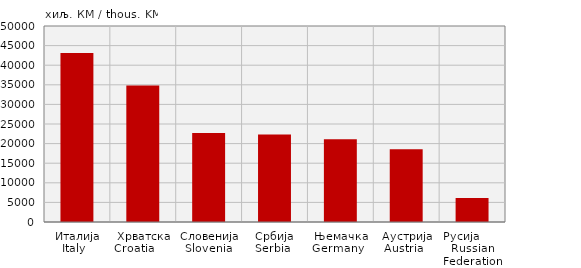
| Category | Извоз
Export |
|---|---|
| Италија
Italy   | 43119 |
| Хрватска
Croatia       | 34809 |
| Словенија
Slovenia  | 22684 |
| Србија
Serbia  | 22330 |
| Њемачка
Germany   | 21122 |
| Аустрија
Austria   | 18540 |
| Русија        Russian Federation | 6123 |